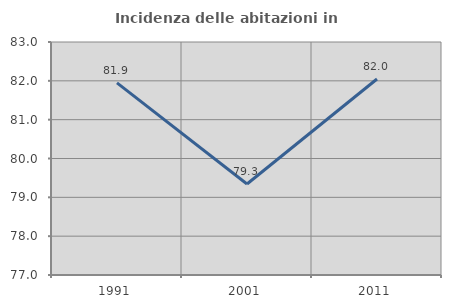
| Category | Incidenza delle abitazioni in proprietà  |
|---|---|
| 1991.0 | 81.949 |
| 2001.0 | 79.343 |
| 2011.0 | 82.048 |